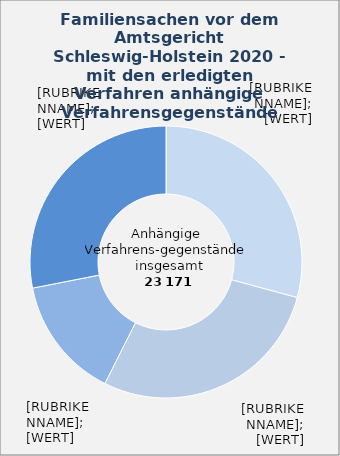
| Category | in Prozent |
|---|---|
| Versorgungsausgleich | 0.292 |
| Scheidung | 0.282 |
| elterliche Sorge | 0.145 |
| Übrige Verfahrensgegenstände¹  | 0.281 |